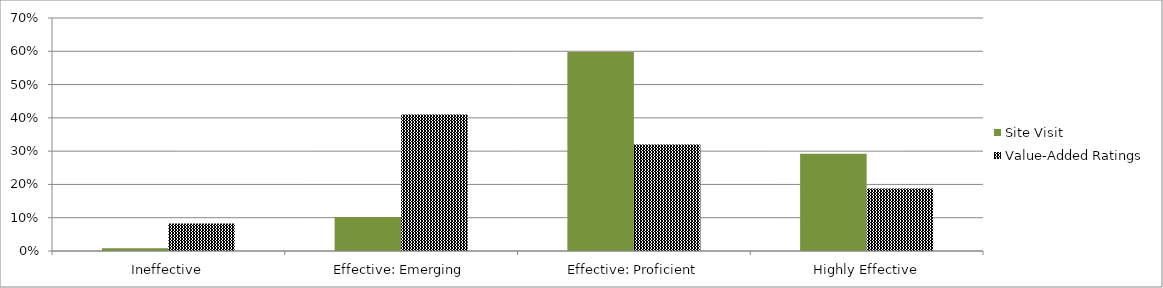
| Category | Site Visit | Value-Added Ratings |
|---|---|---|
| Ineffective | 0.83 | 8.26 |
| Effective: Emerging | 10.19 | 40.99 |
| Effective: Proficient | 59.78 | 32.01 |
| Highly Effective | 29.2 | 18.74 |